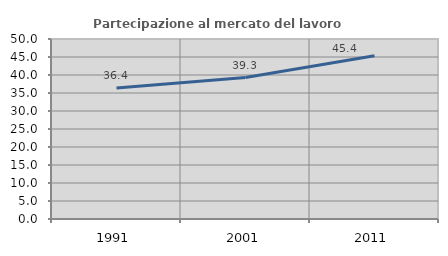
| Category | Partecipazione al mercato del lavoro  femminile |
|---|---|
| 1991.0 | 36.385 |
| 2001.0 | 39.297 |
| 2011.0 | 45.366 |